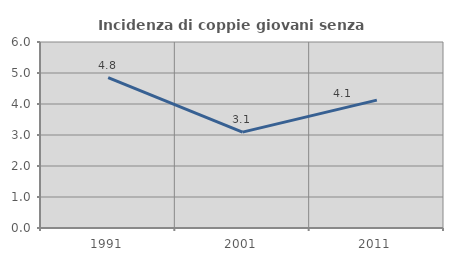
| Category | Incidenza di coppie giovani senza figli |
|---|---|
| 1991.0 | 4.848 |
| 2001.0 | 3.093 |
| 2011.0 | 4.124 |